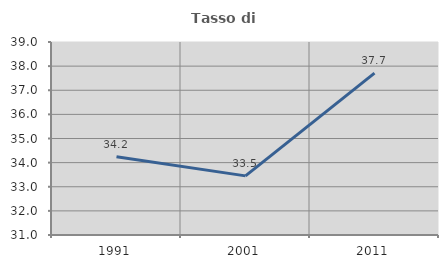
| Category | Tasso di occupazione   |
|---|---|
| 1991.0 | 34.243 |
| 2001.0 | 33.451 |
| 2011.0 | 37.712 |